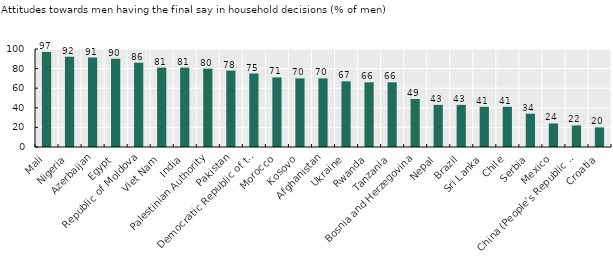
| Category | Series 0 |
|---|---|
| Mali | 97 |
| Nigeria | 92 |
| Azerbaijan | 91.2 |
| Egypt | 90 |
| Republic of Moldova | 86 |
| Viet Nam | 81 |
| India | 81 |
| Palestinian Authority | 80 |
| Pakistan | 78 |
| Democratic Republic of the Congo | 75 |
| Morocco | 71 |
| Kosovo | 70 |
| Afghanistan | 70 |
| Ukraine | 67 |
| Rwanda | 66 |
| Tanzania | 66 |
| Bosnia and Herzegovina | 49 |
| Nepal | 43 |
| Brazil | 43 |
| Sri Lanka | 41 |
| Chile | 41 |
| Serbia | 34 |
| Mexico | 24 |
| China (People’s Republic of) | 22 |
| Croatia | 20 |